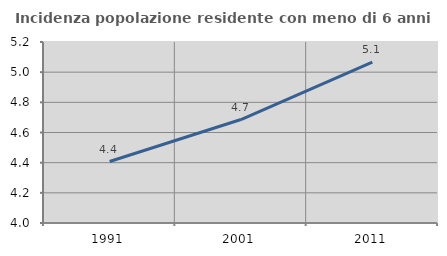
| Category | Incidenza popolazione residente con meno di 6 anni |
|---|---|
| 1991.0 | 4.407 |
| 2001.0 | 4.686 |
| 2011.0 | 5.066 |